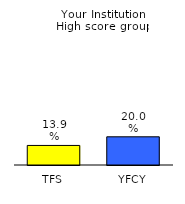
| Category | Series 0 |
|---|---|
| TFS | 0.139 |
| YFCY | 0.2 |